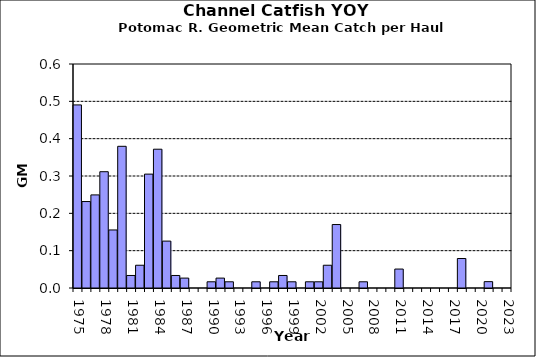
| Category | Series 0 |
|---|---|
| 1975.0 | 0.49 |
| 1976.0 | 0.232 |
| 1977.0 | 0.249 |
| 1978.0 | 0.311 |
| 1979.0 | 0.155 |
| 1980.0 | 0.38 |
| 1981.0 | 0.034 |
| 1982.0 | 0.061 |
| 1983.0 | 0.305 |
| 1984.0 | 0.372 |
| 1985.0 | 0.126 |
| 1986.0 | 0.034 |
| 1987.0 | 0.027 |
| 1988.0 | 0 |
| 1989.0 | 0 |
| 1990.0 | 0.017 |
| 1991.0 | 0.027 |
| 1992.0 | 0.017 |
| 1993.0 | 0 |
| 1994.0 | 0 |
| 1995.0 | 0.017 |
| 1996.0 | 0 |
| 1997.0 | 0.017 |
| 1998.0 | 0.034 |
| 1999.0 | 0.017 |
| 2000.0 | 0 |
| 2001.0 | 0.017 |
| 2002.0 | 0.017 |
| 2003.0 | 0.061 |
| 2004.0 | 0.17 |
| 2005.0 | 0 |
| 2006.0 | 0 |
| 2007.0 | 0.017 |
| 2008.0 | 0 |
| 2009.0 | 0 |
| 2010.0 | 0 |
| 2011.0 | 0.051 |
| 2012.0 | 0 |
| 2013.0 | 0 |
| 2014.0 | 0 |
| 2015.0 | 0 |
| 2016.0 | 0 |
| 2017.0 | 0 |
| 2018.0 | 0.079 |
| 2019.0 | 0 |
| 2020.0 | 0 |
| 2021.0 | 0.017 |
| 2022.0 | 0 |
| 2023.0 | 0 |